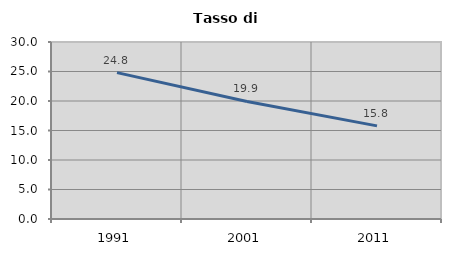
| Category | Tasso di disoccupazione   |
|---|---|
| 1991.0 | 24.806 |
| 2001.0 | 19.923 |
| 2011.0 | 15.784 |